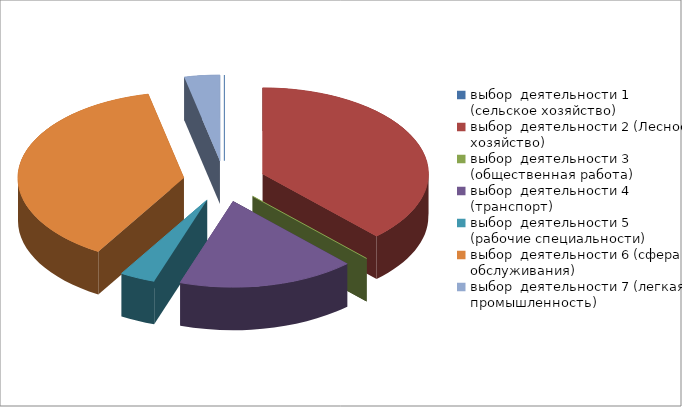
| Category | Series 0 |
|---|---|
| 0 | 0 |
| 1 | 11 |
| 2 | 0 |
| 3 | 5 |
| 4 | 1 |
| 5 | 11 |
| 6 | 1 |